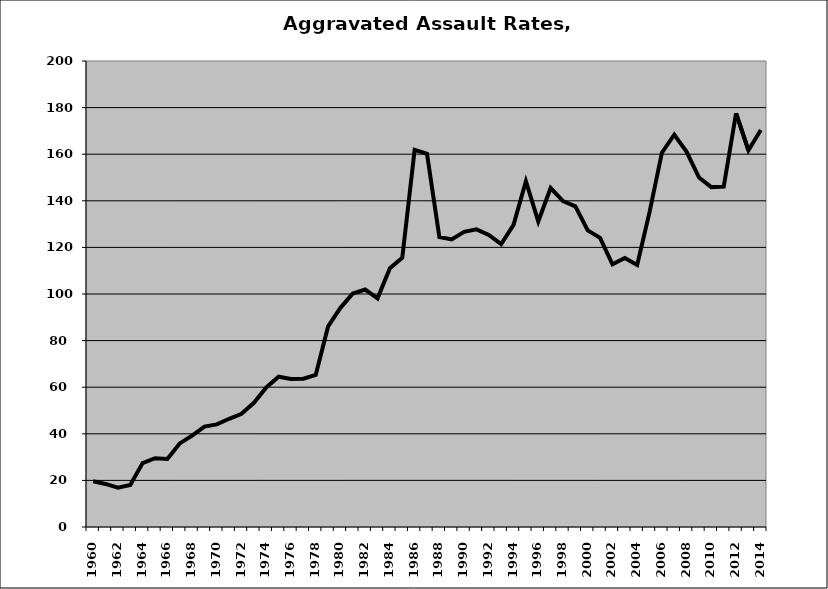
| Category | Aggravated Assault |
|---|---|
| 1960.0 | 19.611 |
| 1961.0 | 18.473 |
| 1962.0 | 16.887 |
| 1963.0 | 18.074 |
| 1964.0 | 27.441 |
| 1965.0 | 29.513 |
| 1966.0 | 29.224 |
| 1967.0 | 35.88 |
| 1968.0 | 39.212 |
| 1969.0 | 43.066 |
| 1970.0 | 44.048 |
| 1971.0 | 46.448 |
| 1972.0 | 48.562 |
| 1973.0 | 53.316 |
| 1974.0 | 59.877 |
| 1975.0 | 64.489 |
| 1976.0 | 63.55 |
| 1977.0 | 63.664 |
| 1978.0 | 65.249 |
| 1979.0 | 86.102 |
| 1980.0 | 94.063 |
| 1981.0 | 100.211 |
| 1982.0 | 101.91 |
| 1983.0 | 98.148 |
| 1984.0 | 111.057 |
| 1985.0 | 115.581 |
| 1986.0 | 161.881 |
| 1987.0 | 160.183 |
| 1988.0 | 124.475 |
| 1989.0 | 123.403 |
| 1990.0 | 126.662 |
| 1991.0 | 127.75 |
| 1992.0 | 125.345 |
| 1993.0 | 121.397 |
| 1994.0 | 129.673 |
| 1995.0 | 148.39 |
| 1996.0 | 131.143 |
| 1997.0 | 145.474 |
| 1998.0 | 139.893 |
| 1999.0 | 137.607 |
| 2000.0 | 127.319 |
| 2001.0 | 124.086 |
| 2002.0 | 112.764 |
| 2003.0 | 115.485 |
| 2004.0 | 112.491 |
| 2005.0 | 135.157 |
| 2006.0 | 160.641 |
| 2007.0 | 168.361 |
| 2008.0 | 161.028 |
| 2009.0 | 149.997 |
| 2010.0 | 145.877 |
| 2011.0 | 146.064 |
| 2012.0 | 177.568 |
| 2013.0 | 161.676 |
| 2014.0 | 170.367 |